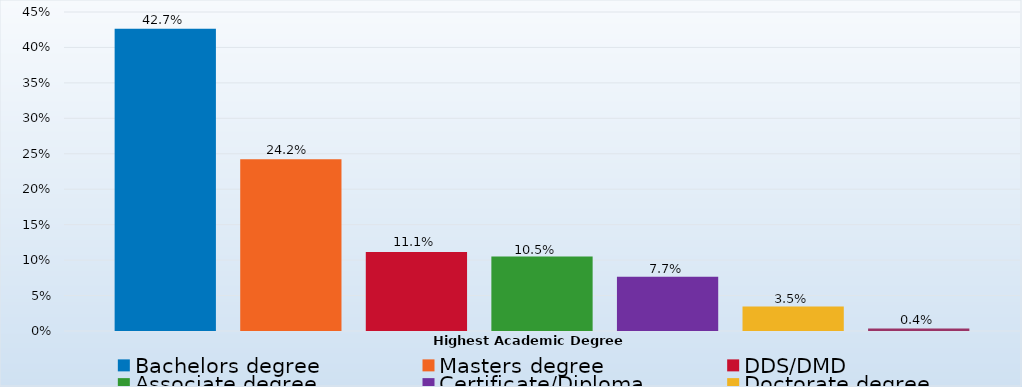
| Category | Bachelors degree | Masters degree | DDS/DMD | Associate degree | Certificate/Diploma | Doctorate degree | Other |
|---|---|---|---|---|---|---|---|
| Percent | 0.427 | 0.242 | 0.111 | 0.105 | 0.077 | 0.035 | 0.004 |